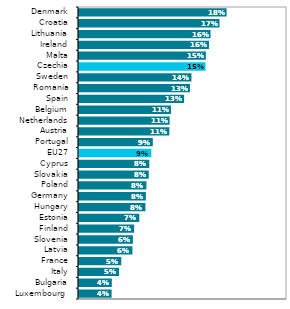
| Category | Series 1 |
|---|---|
| Luxembourg  | 0.039 |
| Bulgaria | 0.039 |
| Italy | 0.048 |
| France | 0.051 |
| Latvia | 0.064 |
| Slovenia | 0.065 |
| Finland | 0.066 |
| Estonia | 0.072 |
| Hungary | 0.08 |
| Germany | 0.08 |
| Poland | 0.081 |
| Slovakia | 0.084 |
| Cyprus | 0.084 |
| EU27 | 0.087 |
| Portugal | 0.089 |
| Austria | 0.109 |
| Netherlands | 0.109 |
| Belgium | 0.111 |
| Spain | 0.126 |
| Romania | 0.133 |
| Sweden | 0.135 |
| Czechia | 0.152 |
| Malta | 0.152 |
| Ireland | 0.156 |
| Lithuania | 0.158 |
| Croatia | 0.169 |
| Denmark | 0.177 |